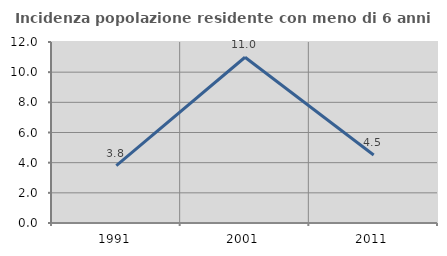
| Category | Incidenza popolazione residente con meno di 6 anni |
|---|---|
| 1991.0 | 3.81 |
| 2001.0 | 10.989 |
| 2011.0 | 4.505 |